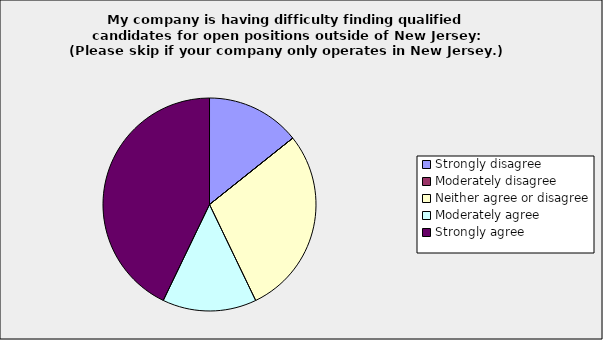
| Category | Series 0 |
|---|---|
| Strongly disagree | 0.143 |
| Moderately disagree | 0 |
| Neither agree or disagree | 0.286 |
| Moderately agree | 0.143 |
| Strongly agree | 0.429 |